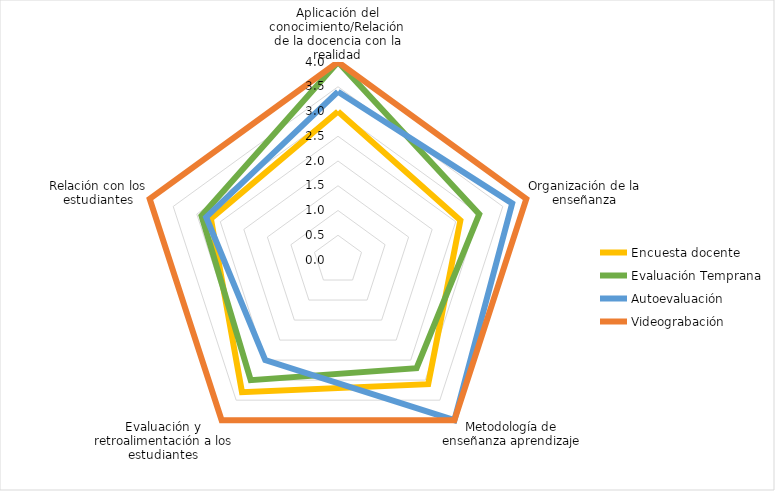
| Category | Encuesta docente | Evaluación Temprana  | Autoevaluación | Videograbación |
|---|---|---|---|---|
| Aplicación del conocimiento/Relación de la docencia con la realidad | 3 | 4 | 3.4 | 4 |
| Organización de la enseñanza | 2.6 | 3 | 3.7 | 4 |
| Metodología de enseñanza aprendizaje | 3.1 | 2.7 | 4 | 4 |
| Evaluación y retroalimentación a los estudiantes | 3.3 | 3 | 2.5 | 4 |
| Relación con los estudiantes | 2.7 | 2.9 | 2.8 | 4 |